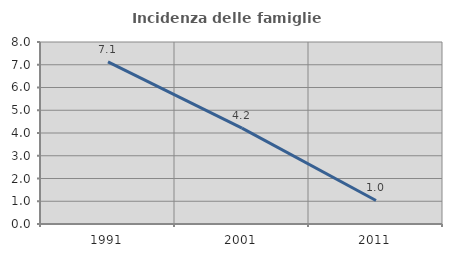
| Category | Incidenza delle famiglie numerose |
|---|---|
| 1991.0 | 7.126 |
| 2001.0 | 4.213 |
| 2011.0 | 1.034 |